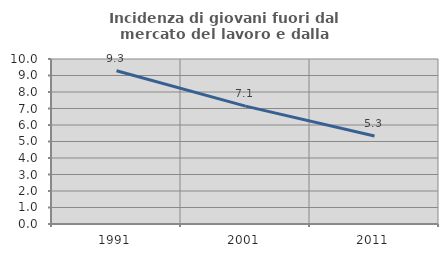
| Category | Incidenza di giovani fuori dal mercato del lavoro e dalla formazione  |
|---|---|
| 1991.0 | 9.291 |
| 2001.0 | 7.143 |
| 2011.0 | 5.335 |